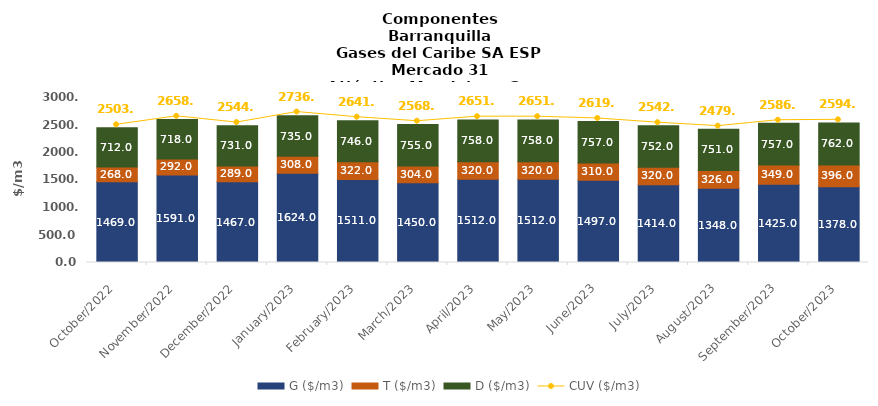
| Category | G ($/m3) | T ($/m3) | D ($/m3) |
|---|---|---|---|
| 2022-10-01 | 1469 | 268 | 712 |
| 2022-11-01 | 1591 | 292 | 718 |
| 2022-12-01 | 1467 | 289 | 731 |
| 2023-01-01 | 1624 | 308 | 735 |
| 2023-02-01 | 1511 | 322 | 746 |
| 2023-03-01 | 1450 | 304 | 755 |
| 2023-04-01 | 1512 | 320 | 758 |
| 2023-05-01 | 1512 | 320 | 758 |
| 2023-06-01 | 1497 | 310 | 757 |
| 2023-07-01 | 1414 | 320 | 752 |
| 2023-08-01 | 1348 | 326 | 751 |
| 2023-09-01 | 1425 | 349 | 757 |
| 2023-10-01 | 1378 | 396 | 762 |